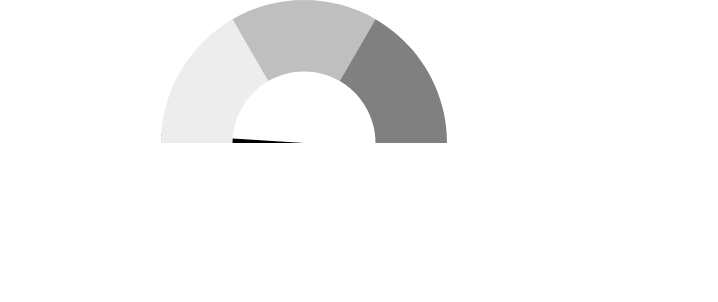
| Category | Series 1 |
|---|---|
| 0 | 0 |
| 1 | 2 |
| 2 | 198 |